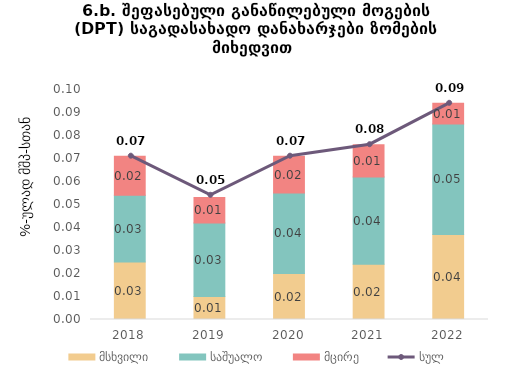
| Category | მსხვილი | საშუალო | მცირე |
|---|---|---|---|
| 2018.0 | 0.025 | 0.029 | 0.017 |
| 2019.0 | 0.01 | 0.032 | 0.011 |
| 2020.0 | 0.02 | 0.035 | 0.016 |
| 2021.0 | 0.024 | 0.038 | 0.014 |
| 2022.0 | 0.037 | 0.048 | 0.009 |